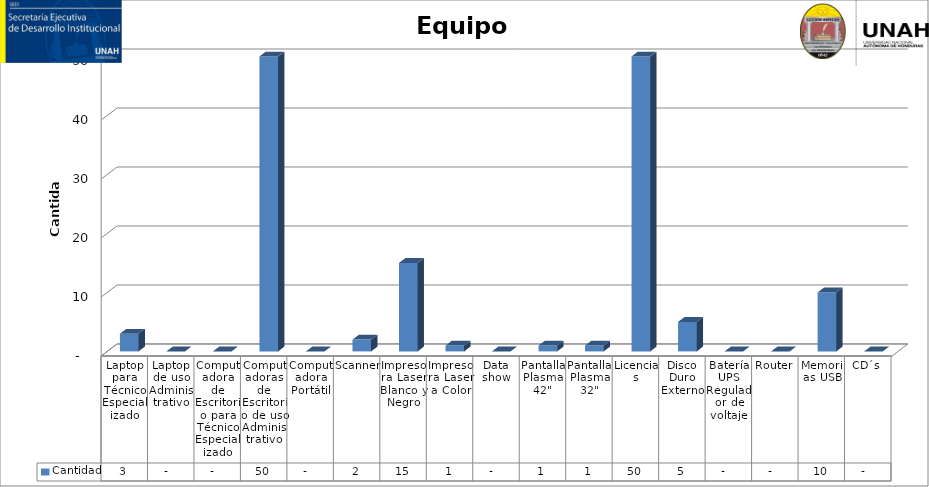
| Category | Cantidad |
|---|---|
| Laptop para Técnico Especializado | 3 |
| Laptop de uso Administrativo | 0 |
| Computadora de Escritorio para Técnico Especializado | 0 |
| Computadoras de Escritorio de uso Administrativo | 50 |
| Computadora Portátil | 0 |
| Scanner | 2 |
| Impresora Laser Blanco y Negro | 15 |
| Impresora Laser a Color | 1 |
| Data show | 0 |
| Pantalla Plasma 42" | 1 |
| Pantalla Plasma 32" | 1 |
| Licencias | 50 |
| Disco Duro Externo | 5 |
| Batería UPS Regulador de voltaje | 0 |
| Router | 0 |
| Memorias USB | 10 |
| CD´s | 0 |